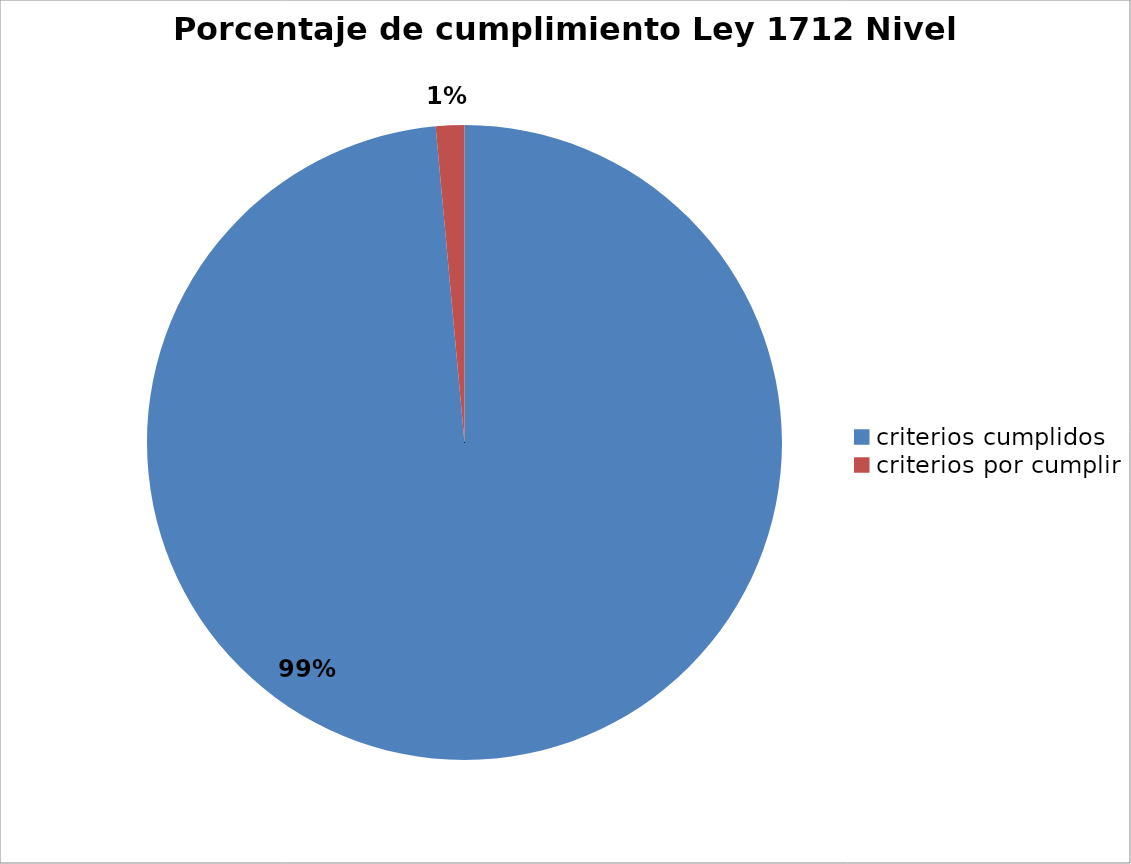
| Category | Series 0 |
|---|---|
| criterios cumplidos | 136 |
| criterios por cumplir | 2 |